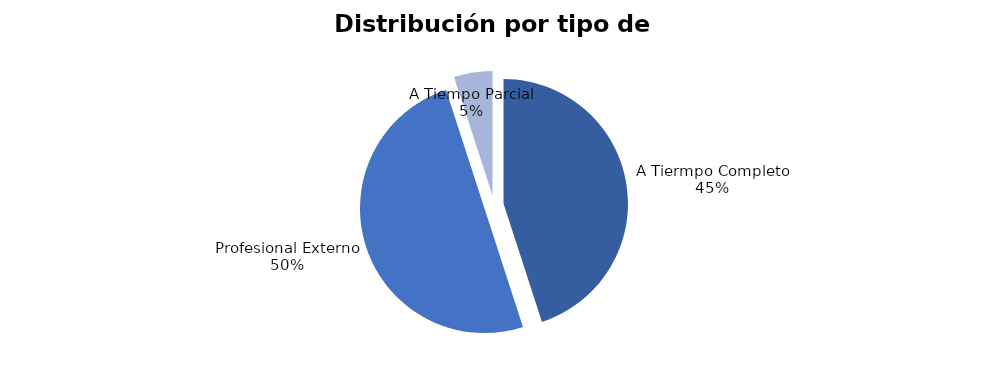
| Category | 9 |
|---|---|
| A Tiermpo Completo | 9 |
| Profesional Externo | 10 |
| A Tiempo Parcial | 1 |